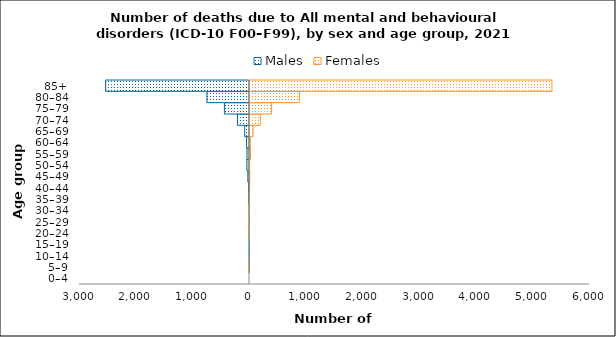
| Category | Males | Females |
|---|---|---|
| 0–4 | 0 | 0 |
| 5–9 | -1 | 1 |
| 10–14 | -1 | 0 |
| 15–19 | -4 | 0 |
| 20–24 | -3 | 2 |
| 25–29 | -1 | 2 |
| 30–34 | -3 | 3 |
| 35–39 | -10 | 5 |
| 40–44 | -17 | 12 |
| 45–49 | -29 | 13 |
| 50–54 | -45 | 11 |
| 55–59 | -44 | 26 |
| 60–64 | -51 | 23 |
| 65–69 | -85 | 71 |
| 70–74 | -213 | 199 |
| 75–79 | -443 | 399 |
| 80–84 | -751 | 889 |
| 85+ | -2538 | 5346 |